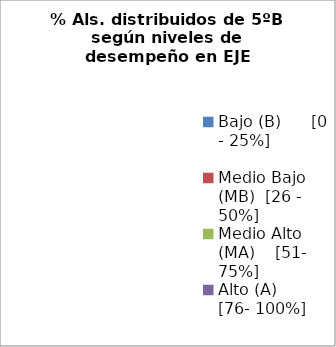
| Category | Series 0 |
|---|---|
| Bajo (B)      [0 - 25%] | 0 |
| Medio Bajo (MB)  [26 - 50%] | 0 |
| Medio Alto (MA)    [51- 75%] | 0 |
| Alto (A)       [76- 100%] | 0 |